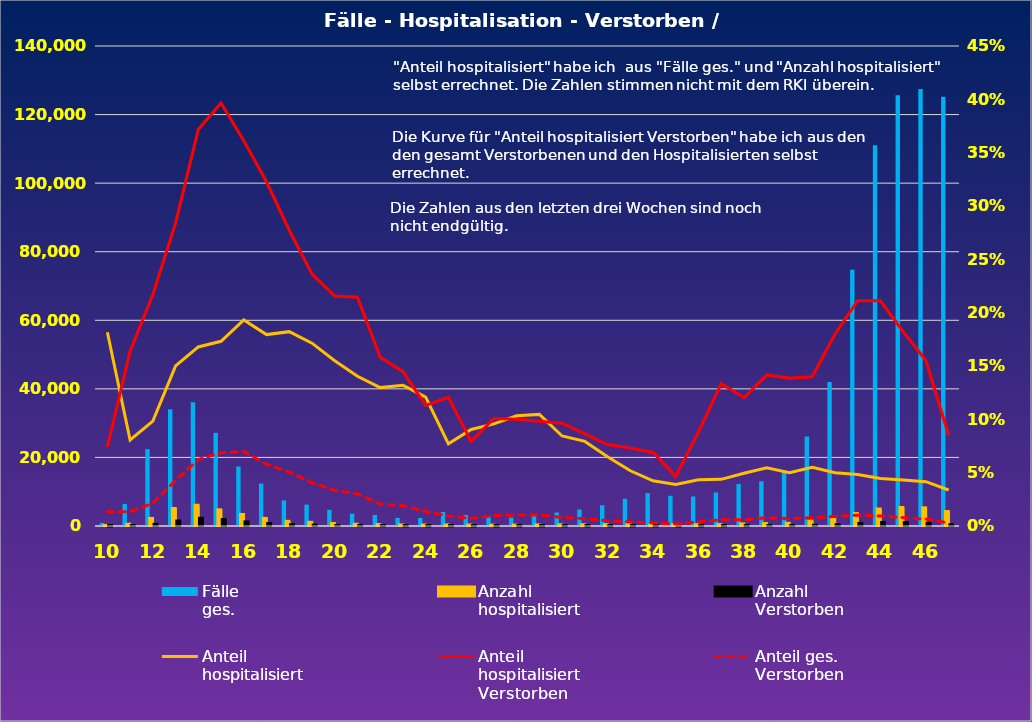
| Category | Fälle
ges. | Anzahl
hospitalisiert | Anzahl
Verstorben |
|---|---|---|---|
| 10.0 | 892 | 162 | 12 |
| 11.0 | 6434 | 519 | 85 |
| 12.0 | 22429 | 2205 | 478 |
| 13.0 | 34025 | 5106 | 1450 |
| 14.0 | 36086 | 6058 | 2252 |
| 15.0 | 27181 | 4706 | 1866 |
| 16.0 | 17353 | 3353 | 1211 |
| 17.0 | 12383 | 2222 | 717 |
| 18.0 | 7442 | 1356 | 376 |
| 19.0 | 6225 | 1067 | 252 |
| 20.0 | 4732 | 733 | 158 |
| 21.0 | 3618 | 508 | 109 |
| 22.0 | 3214 | 417 | 66 |
| 23.0 | 2356 | 311 | 45 |
| 24.0 | 2343 | 283 | 32 |
| 25.0 | 4090 | 315 | 38 |
| 26.0 | 3203 | 290 | 23 |
| 27.0 | 2695 | 258 | 26 |
| 28.0 | 2418 | 250 | 25 |
| 29.0 | 3020 | 316 | 31 |
| 30.0 | 3934 | 332 | 32 |
| 31.0 | 4817 | 382 | 33 |
| 32.0 | 6050 | 393 | 30 |
| 33.0 | 7940 | 411 | 30 |
| 34.0 | 9590 | 406 | 28 |
| 35.0 | 8812 | 344 | 16 |
| 36.0 | 8610 | 374 | 33 |
| 37.0 | 9768 | 427 | 57 |
| 38.0 | 12264 | 607 | 73 |
| 39.0 | 13049 | 713 | 101 |
| 40.0 | 15893 | 794 | 110 |
| 41.0 | 26129 | 1436 | 201 |
| 42.0 | 42020 | 2097 | 377 |
| 43.0 | 74731 | 3612 | 763 |
| 44.0 | 111068 | 4949 | 1045 |
| 45.0 | 125623 | 5407 | 985 |
| 46.0 | 127472 | 5298 | 822 |
| 47.0 | 125162 | 4221 | 359 |